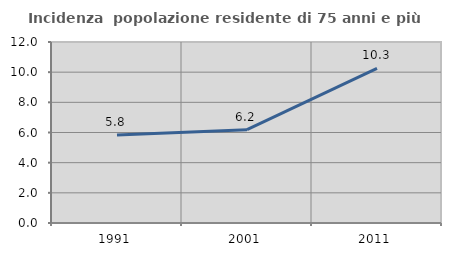
| Category | Incidenza  popolazione residente di 75 anni e più |
|---|---|
| 1991.0 | 5.838 |
| 2001.0 | 6.188 |
| 2011.0 | 10.257 |